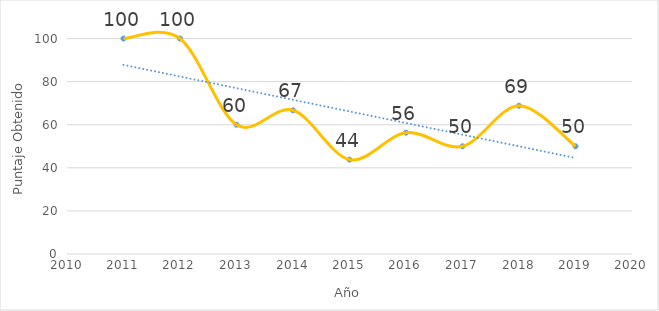
| Category | Planificación |
|---|---|
| 2011.0 | 100 |
| 2012.0 | 100 |
| 2013.0 | 60 |
| 2014.0 | 66.7 |
| 2015.0 | 43.8 |
| 2016.0 | 56.3 |
| 2017.0 | 50 |
| 2018.0 | 68.8 |
| 2019.0 | 50 |